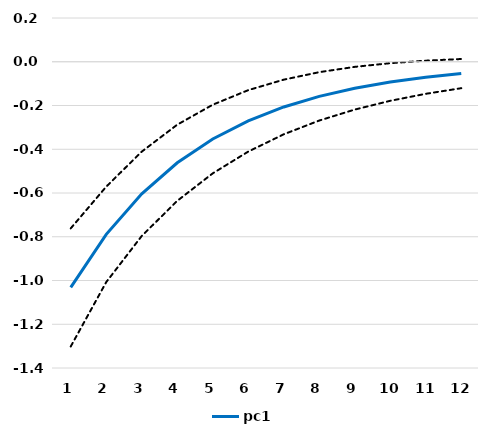
| Category | Series 0 | pc1 | Series 2 |
|---|---|---|---|
| 1.0 | -0.762 | -1.032 | -1.302 |
| 2.0 | -0.571 | -0.789 | -1.007 |
| 3.0 | -0.411 | -0.604 | -0.796 |
| 4.0 | -0.288 | -0.462 | -0.636 |
| 5.0 | -0.196 | -0.353 | -0.51 |
| 6.0 | -0.13 | -0.27 | -0.411 |
| 7.0 | -0.082 | -0.207 | -0.332 |
| 8.0 | -0.048 | -0.158 | -0.269 |
| 9.0 | -0.023 | -0.121 | -0.219 |
| 10.0 | -0.007 | -0.093 | -0.179 |
| 11.0 | 0.005 | -0.071 | -0.147 |
| 12.0 | 0.013 | -0.054 | -0.121 |